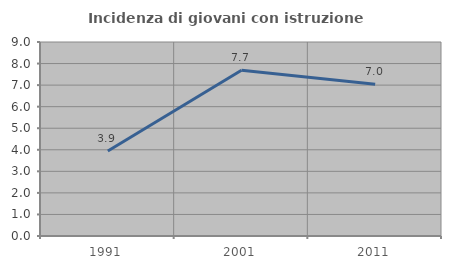
| Category | Incidenza di giovani con istruzione universitaria |
|---|---|
| 1991.0 | 3.947 |
| 2001.0 | 7.692 |
| 2011.0 | 7.042 |